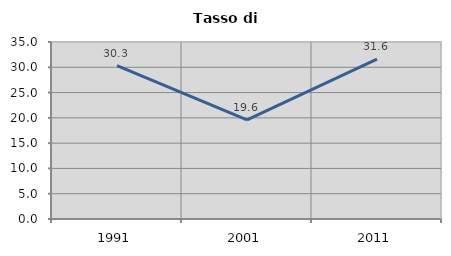
| Category | Tasso di disoccupazione   |
|---|---|
| 1991.0 | 30.344 |
| 2001.0 | 19.608 |
| 2011.0 | 31.628 |